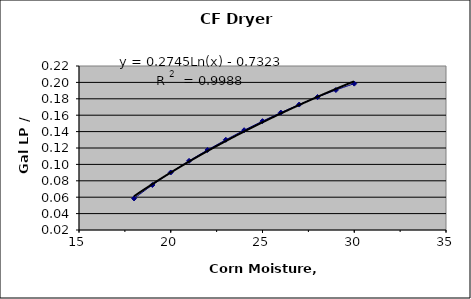
| Category | Series 0 |
|---|---|
| 18.0 | 0.058 |
| 19.0 | 0.075 |
| 20.0 | 0.09 |
| 21.0 | 0.104 |
| 22.0 | 0.118 |
| 23.0 | 0.13 |
| 24.0 | 0.142 |
| 25.0 | 0.153 |
| 26.0 | 0.163 |
| 27.0 | 0.173 |
| 28.0 | 0.182 |
| 29.0 | 0.191 |
| 30.0 | 0.199 |